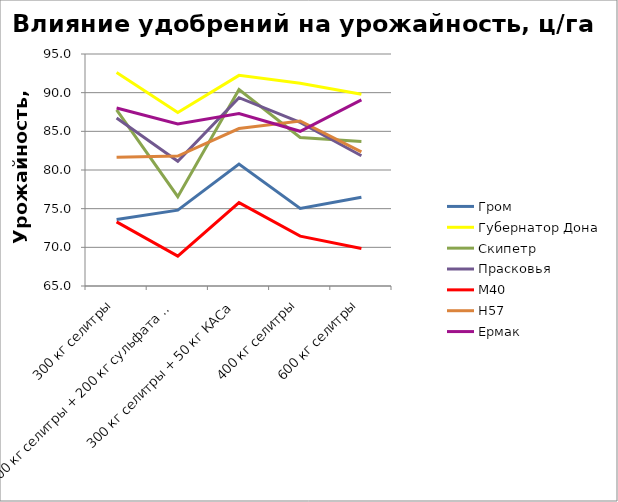
| Category | Гром | Губернатор Дона | Скипетр | Прасковья | М40 | Н57 | Ермак |
|---|---|---|---|---|---|---|---|
| 300 кг селитры | 73.609 | 92.609 | 87.764 | 86.735 | 73.296 | 81.656 | 88.019 |
| 300 кг селитры + 200 кг сульфата кальция | 74.808 | 87.429 | 76.549 | 81.119 | 68.86 | 81.802 | 85.966 |
| 300 кг селитры + 50 кг КАСа | 80.766 | 92.236 | 90.4 | 89.347 | 75.778 | 85.363 | 87.301 |
| 400 кг селитры | 75.025 | 91.226 | 84.208 | 86.163 | 71.449 | 86.332 | 85.003 |
| 600 кг селитры | 76.488 | 89.796 | 83.679 | 81.837 | 69.845 | 82.355 | 89.058 |